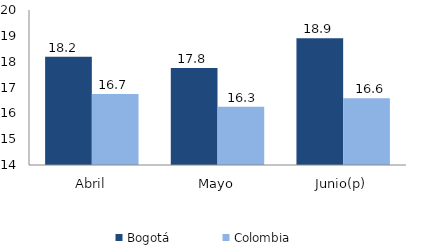
| Category | Bogotá | Colombia |
|---|---|---|
| Abril | 18.187 | 16.748 |
| Mayo | 17.751 | 16.258 |
| Junio(p) | 18.909 | 16.582 |